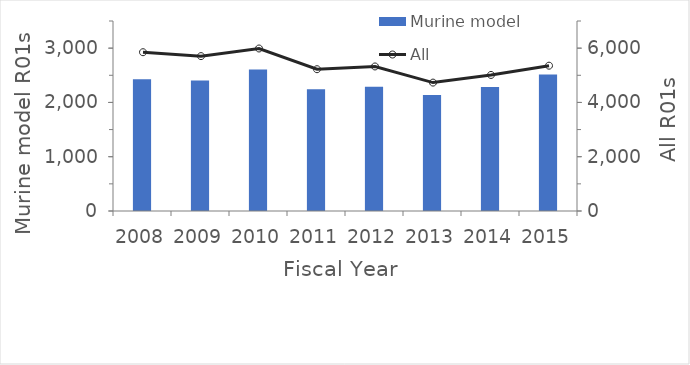
| Category | Murine model |
|---|---|
| 2008.0 | 2428 |
| 2009.0 | 2406 |
| 2010.0 | 2608 |
| 2011.0 | 2245 |
| 2012.0 | 2289 |
| 2013.0 | 2138 |
| 2014.0 | 2283 |
| 2015.0 | 2515 |